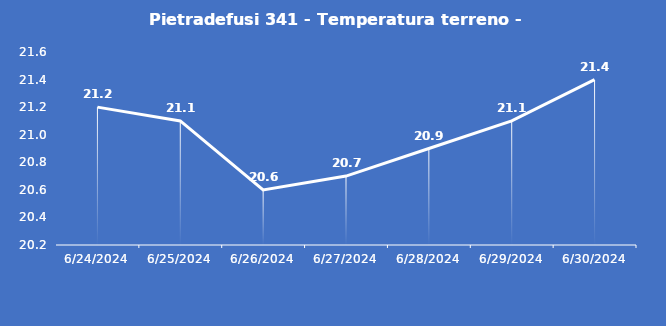
| Category | Pietradefusi 341 - Temperatura terreno - Grezzo (°C) |
|---|---|
| 6/24/24 | 21.2 |
| 6/25/24 | 21.1 |
| 6/26/24 | 20.6 |
| 6/27/24 | 20.7 |
| 6/28/24 | 20.9 |
| 6/29/24 | 21.1 |
| 6/30/24 | 21.4 |